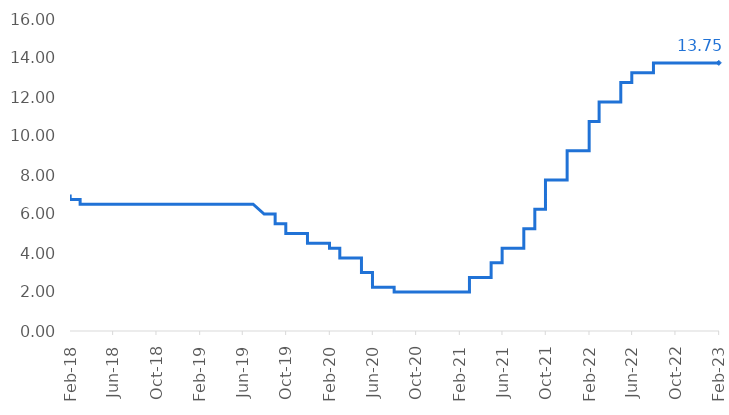
| Category | Selic |
|---|---|
| 2018-02-01 | 7 |
| 2018-02-01 | 7 |
| 2018-02-01 | 7 |
| 2018-02-01 | 7 |
| 2018-02-01 | 7 |
| 2018-02-01 | 7 |
| 2018-02-01 | 6.75 |
| 2018-02-01 | 6.75 |
| 2018-02-01 | 6.75 |
| 2018-02-01 | 6.75 |
| 2018-02-01 | 6.75 |
| 2018-02-01 | 6.75 |
| 2018-02-01 | 6.75 |
| 2018-02-01 | 6.75 |
| 2018-02-01 | 6.75 |
| 2018-02-01 | 6.75 |
| 2018-02-01 | 6.75 |
| 2018-02-01 | 6.75 |
| 2018-02-01 | 6.75 |
| 2018-02-01 | 6.75 |
| 2018-02-01 | 6.75 |
| 2018-02-01 | 6.75 |
| 2018-02-01 | 6.75 |
| 2018-02-01 | 6.75 |
| 2018-02-01 | 6.75 |
| 2018-02-01 | 6.75 |
| 2018-02-01 | 6.75 |
| 2018-03-01 | 6.75 |
| 2018-03-01 | 6.75 |
| 2018-03-01 | 6.75 |
| 2018-03-01 | 6.75 |
| 2018-03-01 | 6.75 |
| 2018-03-01 | 6.75 |
| 2018-03-01 | 6.75 |
| 2018-03-01 | 6.75 |
| 2018-03-01 | 6.75 |
| 2018-03-01 | 6.75 |
| 2018-03-01 | 6.75 |
| 2018-03-01 | 6.75 |
| 2018-03-01 | 6.75 |
| 2018-03-01 | 6.75 |
| 2018-03-01 | 6.75 |
| 2018-03-01 | 6.75 |
| 2018-03-01 | 6.75 |
| 2018-03-01 | 6.75 |
| 2018-03-01 | 6.75 |
| 2018-03-01 | 6.75 |
| 2018-03-01 | 6.75 |
| 2018-03-01 | 6.5 |
| 2018-03-01 | 6.5 |
| 2018-03-01 | 6.5 |
| 2018-03-01 | 6.5 |
| 2018-03-01 | 6.5 |
| 2018-03-01 | 6.5 |
| 2018-03-01 | 6.5 |
| 2018-03-01 | 6.5 |
| 2018-03-01 | 6.5 |
| 2018-03-01 | 6.5 |
| 2018-04-01 | 6.5 |
| 2018-04-01 | 6.5 |
| 2018-04-01 | 6.5 |
| 2018-04-01 | 6.5 |
| 2018-04-01 | 6.5 |
| 2018-04-01 | 6.5 |
| 2018-04-01 | 6.5 |
| 2018-04-01 | 6.5 |
| 2018-04-01 | 6.5 |
| 2018-04-01 | 6.5 |
| 2018-04-01 | 6.5 |
| 2018-04-01 | 6.5 |
| 2018-04-01 | 6.5 |
| 2018-04-01 | 6.5 |
| 2018-04-01 | 6.5 |
| 2018-04-01 | 6.5 |
| 2018-04-01 | 6.5 |
| 2018-04-01 | 6.5 |
| 2018-04-01 | 6.5 |
| 2018-04-01 | 6.5 |
| 2018-04-01 | 6.5 |
| 2018-04-01 | 6.5 |
| 2018-04-01 | 6.5 |
| 2018-04-01 | 6.5 |
| 2018-04-01 | 6.5 |
| 2018-04-01 | 6.5 |
| 2018-04-01 | 6.5 |
| 2018-04-01 | 6.5 |
| 2018-04-01 | 6.5 |
| 2018-04-01 | 6.5 |
| 2018-05-01 | 6.5 |
| 2018-05-01 | 6.5 |
| 2018-05-01 | 6.5 |
| 2018-05-01 | 6.5 |
| 2018-05-01 | 6.5 |
| 2018-05-01 | 6.5 |
| 2018-05-01 | 6.5 |
| 2018-05-01 | 6.5 |
| 2018-05-01 | 6.5 |
| 2018-05-01 | 6.5 |
| 2018-05-01 | 6.5 |
| 2018-05-01 | 6.5 |
| 2018-05-01 | 6.5 |
| 2018-05-01 | 6.5 |
| 2018-05-01 | 6.5 |
| 2018-05-01 | 6.5 |
| 2018-05-01 | 6.5 |
| 2018-05-01 | 6.5 |
| 2018-05-01 | 6.5 |
| 2018-05-01 | 6.5 |
| 2018-05-01 | 6.5 |
| 2018-05-01 | 6.5 |
| 2018-05-01 | 6.5 |
| 2018-05-01 | 6.5 |
| 2018-05-01 | 6.5 |
| 2018-05-01 | 6.5 |
| 2018-05-01 | 6.5 |
| 2018-05-01 | 6.5 |
| 2018-05-01 | 6.5 |
| 2018-05-01 | 6.5 |
| 2018-05-01 | 6.5 |
| 2018-06-01 | 6.5 |
| 2018-06-01 | 6.5 |
| 2018-06-01 | 6.5 |
| 2018-06-01 | 6.5 |
| 2018-06-01 | 6.5 |
| 2018-06-01 | 6.5 |
| 2018-06-01 | 6.5 |
| 2018-06-01 | 6.5 |
| 2018-06-01 | 6.5 |
| 2018-06-01 | 6.5 |
| 2018-06-01 | 6.5 |
| 2018-06-01 | 6.5 |
| 2018-06-01 | 6.5 |
| 2018-06-01 | 6.5 |
| 2018-06-01 | 6.5 |
| 2018-06-01 | 6.5 |
| 2018-06-01 | 6.5 |
| 2018-06-01 | 6.5 |
| 2018-06-01 | 6.5 |
| 2018-06-01 | 6.5 |
| 2018-06-01 | 6.5 |
| 2018-06-01 | 6.5 |
| 2018-06-01 | 6.5 |
| 2018-06-01 | 6.5 |
| 2018-06-01 | 6.5 |
| 2018-06-01 | 6.5 |
| 2018-06-01 | 6.5 |
| 2018-06-01 | 6.5 |
| 2018-06-01 | 6.5 |
| 2018-06-01 | 6.5 |
| 2018-07-01 | 6.5 |
| 2018-07-01 | 6.5 |
| 2018-07-01 | 6.5 |
| 2018-07-01 | 6.5 |
| 2018-07-01 | 6.5 |
| 2018-07-01 | 6.5 |
| 2018-07-01 | 6.5 |
| 2018-07-01 | 6.5 |
| 2018-07-01 | 6.5 |
| 2018-07-01 | 6.5 |
| 2018-07-01 | 6.5 |
| 2018-07-01 | 6.5 |
| 2018-07-01 | 6.5 |
| 2018-07-01 | 6.5 |
| 2018-07-01 | 6.5 |
| 2018-07-01 | 6.5 |
| 2018-07-01 | 6.5 |
| 2018-07-01 | 6.5 |
| 2018-07-01 | 6.5 |
| 2018-07-01 | 6.5 |
| 2018-07-01 | 6.5 |
| 2018-07-01 | 6.5 |
| 2018-07-01 | 6.5 |
| 2018-07-01 | 6.5 |
| 2018-07-01 | 6.5 |
| 2018-07-01 | 6.5 |
| 2018-07-01 | 6.5 |
| 2018-07-01 | 6.5 |
| 2018-07-01 | 6.5 |
| 2018-07-01 | 6.5 |
| 2018-07-01 | 6.5 |
| 2018-08-01 | 6.5 |
| 2018-08-01 | 6.5 |
| 2018-08-01 | 6.5 |
| 2018-08-01 | 6.5 |
| 2018-08-01 | 6.5 |
| 2018-08-01 | 6.5 |
| 2018-08-01 | 6.5 |
| 2018-08-01 | 6.5 |
| 2018-08-01 | 6.5 |
| 2018-08-01 | 6.5 |
| 2018-08-01 | 6.5 |
| 2018-08-01 | 6.5 |
| 2018-08-01 | 6.5 |
| 2018-08-01 | 6.5 |
| 2018-08-01 | 6.5 |
| 2018-08-01 | 6.5 |
| 2018-08-01 | 6.5 |
| 2018-08-01 | 6.5 |
| 2018-08-01 | 6.5 |
| 2018-08-01 | 6.5 |
| 2018-08-01 | 6.5 |
| 2018-08-01 | 6.5 |
| 2018-08-01 | 6.5 |
| 2018-08-01 | 6.5 |
| 2018-08-01 | 6.5 |
| 2018-08-01 | 6.5 |
| 2018-08-01 | 6.5 |
| 2018-08-01 | 6.5 |
| 2018-08-01 | 6.5 |
| 2018-08-01 | 6.5 |
| 2018-08-01 | 6.5 |
| 2018-09-01 | 6.5 |
| 2018-09-01 | 6.5 |
| 2018-09-01 | 6.5 |
| 2018-09-01 | 6.5 |
| 2018-09-01 | 6.5 |
| 2018-09-01 | 6.5 |
| 2018-09-01 | 6.5 |
| 2018-09-01 | 6.5 |
| 2018-09-01 | 6.5 |
| 2018-09-01 | 6.5 |
| 2018-09-01 | 6.5 |
| 2018-09-01 | 6.5 |
| 2018-09-01 | 6.5 |
| 2018-09-01 | 6.5 |
| 2018-09-01 | 6.5 |
| 2018-09-01 | 6.5 |
| 2018-09-01 | 6.5 |
| 2018-09-01 | 6.5 |
| 2018-09-01 | 6.5 |
| 2018-09-01 | 6.5 |
| 2018-09-01 | 6.5 |
| 2018-09-01 | 6.5 |
| 2018-09-01 | 6.5 |
| 2018-09-01 | 6.5 |
| 2018-09-01 | 6.5 |
| 2018-09-01 | 6.5 |
| 2018-09-01 | 6.5 |
| 2018-09-01 | 6.5 |
| 2018-09-01 | 6.5 |
| 2018-09-01 | 6.5 |
| 2018-10-01 | 6.5 |
| 2018-10-01 | 6.5 |
| 2018-10-01 | 6.5 |
| 2018-10-01 | 6.5 |
| 2018-10-01 | 6.5 |
| 2018-10-01 | 6.5 |
| 2018-10-01 | 6.5 |
| 2018-10-01 | 6.5 |
| 2018-10-01 | 6.5 |
| 2018-10-01 | 6.5 |
| 2018-10-01 | 6.5 |
| 2018-10-01 | 6.5 |
| 2018-10-01 | 6.5 |
| 2018-10-01 | 6.5 |
| 2018-10-01 | 6.5 |
| 2018-10-01 | 6.5 |
| 2018-10-01 | 6.5 |
| 2018-10-01 | 6.5 |
| 2018-10-01 | 6.5 |
| 2018-10-01 | 6.5 |
| 2018-10-01 | 6.5 |
| 2018-10-01 | 6.5 |
| 2018-10-01 | 6.5 |
| 2018-10-01 | 6.5 |
| 2018-10-01 | 6.5 |
| 2018-10-01 | 6.5 |
| 2018-10-01 | 6.5 |
| 2018-10-01 | 6.5 |
| 2018-10-01 | 6.5 |
| 2018-10-01 | 6.5 |
| 2018-10-01 | 6.5 |
| 2018-11-01 | 6.5 |
| 2018-11-01 | 6.5 |
| 2018-11-01 | 6.5 |
| 2018-11-01 | 6.5 |
| 2018-11-01 | 6.5 |
| 2018-11-01 | 6.5 |
| 2018-11-01 | 6.5 |
| 2018-11-01 | 6.5 |
| 2018-11-01 | 6.5 |
| 2018-11-01 | 6.5 |
| 2018-11-01 | 6.5 |
| 2018-11-01 | 6.5 |
| 2018-11-01 | 6.5 |
| 2018-11-01 | 6.5 |
| 2018-11-01 | 6.5 |
| 2018-11-01 | 6.5 |
| 2018-11-01 | 6.5 |
| 2018-11-01 | 6.5 |
| 2018-11-01 | 6.5 |
| 2018-11-01 | 6.5 |
| 2018-11-01 | 6.5 |
| 2018-11-01 | 6.5 |
| 2018-11-01 | 6.5 |
| 2018-11-01 | 6.5 |
| 2018-11-01 | 6.5 |
| 2018-11-01 | 6.5 |
| 2018-11-01 | 6.5 |
| 2018-11-01 | 6.5 |
| 2018-11-01 | 6.5 |
| 2018-11-01 | 6.5 |
| 2018-12-01 | 6.5 |
| 2018-12-01 | 6.5 |
| 2018-12-01 | 6.5 |
| 2018-12-01 | 6.5 |
| 2018-12-01 | 6.5 |
| 2018-12-01 | 6.5 |
| 2018-12-01 | 6.5 |
| 2018-12-01 | 6.5 |
| 2018-12-01 | 6.5 |
| 2018-12-01 | 6.5 |
| 2018-12-01 | 6.5 |
| 2018-12-01 | 6.5 |
| 2018-12-01 | 6.5 |
| 2018-12-01 | 6.5 |
| 2018-12-01 | 6.5 |
| 2018-12-01 | 6.5 |
| 2018-12-01 | 6.5 |
| 2018-12-01 | 6.5 |
| 2018-12-01 | 6.5 |
| 2018-12-01 | 6.5 |
| 2018-12-01 | 6.5 |
| 2018-12-01 | 6.5 |
| 2018-12-01 | 6.5 |
| 2018-12-01 | 6.5 |
| 2018-12-01 | 6.5 |
| 2018-12-01 | 6.5 |
| 2018-12-01 | 6.5 |
| 2018-12-01 | 6.5 |
| 2018-12-01 | 6.5 |
| 2018-12-01 | 6.5 |
| 2018-12-01 | 6.5 |
| 2019-01-01 | 6.5 |
| 2019-01-01 | 6.5 |
| 2019-01-01 | 6.5 |
| 2019-01-01 | 6.5 |
| 2019-01-01 | 6.5 |
| 2019-01-01 | 6.5 |
| 2019-01-01 | 6.5 |
| 2019-01-01 | 6.5 |
| 2019-01-01 | 6.5 |
| 2019-01-01 | 6.5 |
| 2019-01-01 | 6.5 |
| 2019-01-01 | 6.5 |
| 2019-01-01 | 6.5 |
| 2019-01-01 | 6.5 |
| 2019-01-01 | 6.5 |
| 2019-01-01 | 6.5 |
| 2019-01-01 | 6.5 |
| 2019-01-01 | 6.5 |
| 2019-01-01 | 6.5 |
| 2019-01-01 | 6.5 |
| 2019-01-01 | 6.5 |
| 2019-01-01 | 6.5 |
| 2019-01-01 | 6.5 |
| 2019-01-01 | 6.5 |
| 2019-01-01 | 6.5 |
| 2019-01-01 | 6.5 |
| 2019-01-01 | 6.5 |
| 2019-01-01 | 6.5 |
| 2019-01-01 | 6.5 |
| 2019-01-01 | 6.5 |
| 2019-01-01 | 6.5 |
| 2019-02-01 | 6.5 |
| 2019-02-01 | 6.5 |
| 2019-02-01 | 6.5 |
| 2019-02-01 | 6.5 |
| 2019-02-01 | 6.5 |
| 2019-02-01 | 6.5 |
| 2019-02-01 | 6.5 |
| 2019-02-01 | 6.5 |
| 2019-02-01 | 6.5 |
| 2019-02-01 | 6.5 |
| 2019-02-01 | 6.5 |
| 2019-02-01 | 6.5 |
| 2019-02-01 | 6.5 |
| 2019-02-01 | 6.5 |
| 2019-02-01 | 6.5 |
| 2019-02-01 | 6.5 |
| 2019-02-01 | 6.5 |
| 2019-02-01 | 6.5 |
| 2019-02-01 | 6.5 |
| 2019-02-01 | 6.5 |
| 2019-02-01 | 6.5 |
| 2019-02-01 | 6.5 |
| 2019-02-01 | 6.5 |
| 2019-02-01 | 6.5 |
| 2019-02-01 | 6.5 |
| 2019-02-01 | 6.5 |
| 2019-02-01 | 6.5 |
| 2019-02-01 | 6.5 |
| 2019-03-01 | 6.5 |
| 2019-03-01 | 6.5 |
| 2019-03-01 | 6.5 |
| 2019-03-01 | 6.5 |
| 2019-03-01 | 6.5 |
| 2019-03-01 | 6.5 |
| 2019-03-01 | 6.5 |
| 2019-03-01 | 6.5 |
| 2019-03-01 | 6.5 |
| 2019-03-01 | 6.5 |
| 2019-03-01 | 6.5 |
| 2019-03-01 | 6.5 |
| 2019-03-01 | 6.5 |
| 2019-03-01 | 6.5 |
| 2019-03-01 | 6.5 |
| 2019-03-01 | 6.5 |
| 2019-03-01 | 6.5 |
| 2019-03-01 | 6.5 |
| 2019-03-01 | 6.5 |
| 2019-03-01 | 6.5 |
| 2019-03-01 | 6.5 |
| 2019-03-01 | 6.5 |
| 2019-03-01 | 6.5 |
| 2019-03-01 | 6.5 |
| 2019-03-01 | 6.5 |
| 2019-03-01 | 6.5 |
| 2019-03-01 | 6.5 |
| 2019-03-01 | 6.5 |
| 2019-03-01 | 6.5 |
| 2019-03-01 | 6.5 |
| 2019-03-01 | 6.5 |
| 2019-04-01 | 6.5 |
| 2019-04-01 | 6.5 |
| 2019-04-01 | 6.5 |
| 2019-04-01 | 6.5 |
| 2019-04-01 | 6.5 |
| 2019-04-01 | 6.5 |
| 2019-04-01 | 6.5 |
| 2019-04-01 | 6.5 |
| 2019-04-01 | 6.5 |
| 2019-04-01 | 6.5 |
| 2019-04-01 | 6.5 |
| 2019-04-01 | 6.5 |
| 2019-04-01 | 6.5 |
| 2019-04-01 | 6.5 |
| 2019-04-01 | 6.5 |
| 2019-04-01 | 6.5 |
| 2019-04-01 | 6.5 |
| 2019-04-01 | 6.5 |
| 2019-04-01 | 6.5 |
| 2019-04-01 | 6.5 |
| 2019-04-01 | 6.5 |
| 2019-04-01 | 6.5 |
| 2019-04-01 | 6.5 |
| 2019-04-01 | 6.5 |
| 2019-04-01 | 6.5 |
| 2019-04-01 | 6.5 |
| 2019-04-01 | 6.5 |
| 2019-04-01 | 6.5 |
| 2019-04-01 | 6.5 |
| 2019-04-01 | 6.5 |
| 2019-05-01 | 6.5 |
| 2019-05-01 | 6.5 |
| 2019-05-01 | 6.5 |
| 2019-05-01 | 6.5 |
| 2019-05-01 | 6.5 |
| 2019-05-01 | 6.5 |
| 2019-05-01 | 6.5 |
| 2019-05-01 | 6.5 |
| 2019-05-01 | 6.5 |
| 2019-05-01 | 6.5 |
| 2019-05-01 | 6.5 |
| 2019-05-01 | 6.5 |
| 2019-05-01 | 6.5 |
| 2019-05-01 | 6.5 |
| 2019-05-01 | 6.5 |
| 2019-05-01 | 6.5 |
| 2019-05-01 | 6.5 |
| 2019-05-01 | 6.5 |
| 2019-05-01 | 6.5 |
| 2019-05-01 | 6.5 |
| 2019-05-01 | 6.5 |
| 2019-05-01 | 6.5 |
| 2019-05-01 | 6.5 |
| 2019-05-01 | 6.5 |
| 2019-05-01 | 6.5 |
| 2019-05-01 | 6.5 |
| 2019-05-01 | 6.5 |
| 2019-05-01 | 6.5 |
| 2019-05-01 | 6.5 |
| 2019-05-01 | 6.5 |
| 2019-05-01 | 6.5 |
| 2019-06-01 | 6.5 |
| 2019-06-01 | 6.5 |
| 2019-06-01 | 6.5 |
| 2019-06-01 | 6.5 |
| 2019-06-01 | 6.5 |
| 2019-06-01 | 6.5 |
| 2019-06-01 | 6.5 |
| 2019-06-01 | 6.5 |
| 2019-06-01 | 6.5 |
| 2019-06-01 | 6.5 |
| 2019-06-01 | 6.5 |
| 2019-06-01 | 6.5 |
| 2019-06-01 | 6.5 |
| 2019-06-01 | 6.5 |
| 2019-06-01 | 6.5 |
| 2019-06-01 | 6.5 |
| 2019-06-01 | 6.5 |
| 2019-06-01 | 6.5 |
| 2019-06-01 | 6.5 |
| 2019-06-01 | 6.5 |
| 2019-06-01 | 6.5 |
| 2019-06-01 | 6.5 |
| 2019-06-01 | 6.5 |
| 2019-06-01 | 6.5 |
| 2019-06-01 | 6.5 |
| 2019-06-01 | 6.5 |
| 2019-06-01 | 6.5 |
| 2019-06-01 | 6.5 |
| 2019-06-01 | 6.5 |
| 2019-06-01 | 6.5 |
| 2019-07-01 | 6.5 |
| 2019-07-01 | 6.5 |
| 2019-07-01 | 6.5 |
| 2019-07-01 | 6.5 |
| 2019-07-01 | 6.5 |
| 2019-07-01 | 6.5 |
| 2019-07-01 | 6.5 |
| 2019-07-01 | 6.5 |
| 2019-07-01 | 6.5 |
| 2019-07-01 | 6.5 |
| 2019-07-01 | 6.5 |
| 2019-07-01 | 6.5 |
| 2019-07-01 | 6.5 |
| 2019-07-01 | 6.5 |
| 2019-07-01 | 6.5 |
| 2019-07-01 | 6.5 |
| 2019-07-01 | 6.5 |
| 2019-07-01 | 6.5 |
| 2019-07-01 | 6.5 |
| 2019-07-01 | 6.5 |
| 2019-07-01 | 6.5 |
| 2019-07-01 | 6.5 |
| 2019-07-01 | 6.5 |
| 2019-07-01 | 6.5 |
| 2019-07-01 | 6.5 |
| 2019-07-01 | 6.5 |
| 2019-07-01 | 6.5 |
| 2019-07-01 | 6.5 |
| 2019-07-01 | 6.5 |
| 2019-07-01 | 6.5 |
| 2019-07-01 | 6.5 |
| 2019-08-01 | 6 |
| 2019-08-01 | 6 |
| 2019-08-01 | 6 |
| 2019-08-01 | 6 |
| 2019-08-01 | 6 |
| 2019-08-01 | 6 |
| 2019-08-01 | 6 |
| 2019-08-01 | 6 |
| 2019-08-01 | 6 |
| 2019-08-01 | 6 |
| 2019-08-01 | 6 |
| 2019-08-01 | 6 |
| 2019-08-01 | 6 |
| 2019-08-01 | 6 |
| 2019-08-01 | 6 |
| 2019-08-01 | 6 |
| 2019-08-01 | 6 |
| 2019-08-01 | 6 |
| 2019-08-01 | 6 |
| 2019-08-01 | 6 |
| 2019-08-01 | 6 |
| 2019-08-01 | 6 |
| 2019-08-01 | 6 |
| 2019-08-01 | 6 |
| 2019-08-01 | 6 |
| 2019-08-01 | 6 |
| 2019-08-01 | 6 |
| 2019-08-01 | 6 |
| 2019-08-01 | 6 |
| 2019-08-01 | 6 |
| 2019-08-01 | 6 |
| 2019-09-01 | 6 |
| 2019-09-01 | 6 |
| 2019-09-01 | 6 |
| 2019-09-01 | 6 |
| 2019-09-01 | 6 |
| 2019-09-01 | 6 |
| 2019-09-01 | 6 |
| 2019-09-01 | 6 |
| 2019-09-01 | 6 |
| 2019-09-01 | 6 |
| 2019-09-01 | 6 |
| 2019-09-01 | 6 |
| 2019-09-01 | 6 |
| 2019-09-01 | 6 |
| 2019-09-01 | 6 |
| 2019-09-01 | 6 |
| 2019-09-01 | 6 |
| 2019-09-01 | 6 |
| 2019-09-01 | 5.5 |
| 2019-09-01 | 5.5 |
| 2019-09-01 | 5.5 |
| 2019-09-01 | 5.5 |
| 2019-09-01 | 5.5 |
| 2019-09-01 | 5.5 |
| 2019-09-01 | 5.5 |
| 2019-09-01 | 5.5 |
| 2019-09-01 | 5.5 |
| 2019-09-01 | 5.5 |
| 2019-09-01 | 5.5 |
| 2019-09-01 | 5.5 |
| 2019-10-01 | 5.5 |
| 2019-10-01 | 5.5 |
| 2019-10-01 | 5.5 |
| 2019-10-01 | 5.5 |
| 2019-10-01 | 5.5 |
| 2019-10-01 | 5.5 |
| 2019-10-01 | 5.5 |
| 2019-10-01 | 5.5 |
| 2019-10-01 | 5.5 |
| 2019-10-01 | 5.5 |
| 2019-10-01 | 5.5 |
| 2019-10-01 | 5.5 |
| 2019-10-01 | 5.5 |
| 2019-10-01 | 5.5 |
| 2019-10-01 | 5.5 |
| 2019-10-01 | 5.5 |
| 2019-10-01 | 5.5 |
| 2019-10-01 | 5.5 |
| 2019-10-01 | 5.5 |
| 2019-10-01 | 5.5 |
| 2019-10-01 | 5.5 |
| 2019-10-01 | 5.5 |
| 2019-10-01 | 5.5 |
| 2019-10-01 | 5.5 |
| 2019-10-01 | 5.5 |
| 2019-10-01 | 5.5 |
| 2019-10-01 | 5.5 |
| 2019-10-01 | 5.5 |
| 2019-10-01 | 5.5 |
| 2019-10-01 | 5.5 |
| 2019-10-01 | 5 |
| 2019-11-01 | 5 |
| 2019-11-01 | 5 |
| 2019-11-01 | 5 |
| 2019-11-01 | 5 |
| 2019-11-01 | 5 |
| 2019-11-01 | 5 |
| 2019-11-01 | 5 |
| 2019-11-01 | 5 |
| 2019-11-01 | 5 |
| 2019-11-01 | 5 |
| 2019-11-01 | 5 |
| 2019-11-01 | 5 |
| 2019-11-01 | 5 |
| 2019-11-01 | 5 |
| 2019-11-01 | 5 |
| 2019-11-01 | 5 |
| 2019-11-01 | 5 |
| 2019-11-01 | 5 |
| 2019-11-01 | 5 |
| 2019-11-01 | 5 |
| 2019-11-01 | 5 |
| 2019-11-01 | 5 |
| 2019-11-01 | 5 |
| 2019-11-01 | 5 |
| 2019-11-01 | 5 |
| 2019-11-01 | 5 |
| 2019-11-01 | 5 |
| 2019-11-01 | 5 |
| 2019-11-01 | 5 |
| 2019-11-01 | 5 |
| 2019-12-01 | 5 |
| 2019-12-01 | 5 |
| 2019-12-01 | 5 |
| 2019-12-01 | 5 |
| 2019-12-01 | 5 |
| 2019-12-01 | 5 |
| 2019-12-01 | 5 |
| 2019-12-01 | 5 |
| 2019-12-01 | 5 |
| 2019-12-01 | 5 |
| 2019-12-01 | 5 |
| 2019-12-01 | 4.5 |
| 2019-12-01 | 4.5 |
| 2019-12-01 | 4.5 |
| 2019-12-01 | 4.5 |
| 2019-12-01 | 4.5 |
| 2019-12-01 | 4.5 |
| 2019-12-01 | 4.5 |
| 2019-12-01 | 4.5 |
| 2019-12-01 | 4.5 |
| 2019-12-01 | 4.5 |
| 2019-12-01 | 4.5 |
| 2019-12-01 | 4.5 |
| 2019-12-01 | 4.5 |
| 2019-12-01 | 4.5 |
| 2019-12-01 | 4.5 |
| 2019-12-01 | 4.5 |
| 2019-12-01 | 4.5 |
| 2019-12-01 | 4.5 |
| 2019-12-01 | 4.5 |
| 2019-12-01 | 4.5 |
| 2020-01-01 | 4.5 |
| 2020-01-01 | 4.5 |
| 2020-01-01 | 4.5 |
| 2020-01-01 | 4.5 |
| 2020-01-01 | 4.5 |
| 2020-01-01 | 4.5 |
| 2020-01-01 | 4.5 |
| 2020-01-01 | 4.5 |
| 2020-01-01 | 4.5 |
| 2020-01-01 | 4.5 |
| 2020-01-01 | 4.5 |
| 2020-01-01 | 4.5 |
| 2020-01-01 | 4.5 |
| 2020-01-01 | 4.5 |
| 2020-01-01 | 4.5 |
| 2020-01-01 | 4.5 |
| 2020-01-01 | 4.5 |
| 2020-01-01 | 4.5 |
| 2020-01-01 | 4.5 |
| 2020-01-01 | 4.5 |
| 2020-01-01 | 4.5 |
| 2020-01-01 | 4.5 |
| 2020-01-01 | 4.5 |
| 2020-01-01 | 4.5 |
| 2020-01-01 | 4.5 |
| 2020-01-01 | 4.5 |
| 2020-01-01 | 4.5 |
| 2020-01-01 | 4.5 |
| 2020-01-01 | 4.5 |
| 2020-01-01 | 4.5 |
| 2020-01-01 | 4.5 |
| 2020-02-01 | 4.5 |
| 2020-02-01 | 4.5 |
| 2020-02-01 | 4.5 |
| 2020-02-01 | 4.5 |
| 2020-02-01 | 4.5 |
| 2020-02-01 | 4.25 |
| 2020-02-01 | 4.25 |
| 2020-02-01 | 4.25 |
| 2020-02-01 | 4.25 |
| 2020-02-01 | 4.25 |
| 2020-02-01 | 4.25 |
| 2020-02-01 | 4.25 |
| 2020-02-01 | 4.25 |
| 2020-02-01 | 4.25 |
| 2020-02-01 | 4.25 |
| 2020-02-01 | 4.25 |
| 2020-02-01 | 4.25 |
| 2020-02-01 | 4.25 |
| 2020-02-01 | 4.25 |
| 2020-02-01 | 4.25 |
| 2020-02-01 | 4.25 |
| 2020-02-01 | 4.25 |
| 2020-02-01 | 4.25 |
| 2020-02-01 | 4.25 |
| 2020-02-01 | 4.25 |
| 2020-02-01 | 4.25 |
| 2020-02-01 | 4.25 |
| 2020-02-01 | 4.25 |
| 2020-02-01 | 4.25 |
| 2020-03-01 | 4.25 |
| 2020-03-01 | 4.25 |
| 2020-03-01 | 4.25 |
| 2020-03-01 | 4.25 |
| 2020-03-01 | 4.25 |
| 2020-03-01 | 4.25 |
| 2020-03-01 | 4.25 |
| 2020-03-01 | 4.25 |
| 2020-03-01 | 4.25 |
| 2020-03-01 | 4.25 |
| 2020-03-01 | 4.25 |
| 2020-03-01 | 4.25 |
| 2020-03-01 | 4.25 |
| 2020-03-01 | 4.25 |
| 2020-03-01 | 4.25 |
| 2020-03-01 | 4.25 |
| 2020-03-01 | 4.25 |
| 2020-03-01 | 4.25 |
| 2020-03-01 | 3.75 |
| 2020-03-01 | 3.75 |
| 2020-03-01 | 3.75 |
| 2020-03-01 | 3.75 |
| 2020-03-01 | 3.75 |
| 2020-03-01 | 3.75 |
| 2020-03-01 | 3.75 |
| 2020-03-01 | 3.75 |
| 2020-03-01 | 3.75 |
| 2020-03-01 | 3.75 |
| 2020-03-01 | 3.75 |
| 2020-03-01 | 3.75 |
| 2020-03-01 | 3.75 |
| 2020-04-01 | 3.75 |
| 2020-04-01 | 3.75 |
| 2020-04-01 | 3.75 |
| 2020-04-01 | 3.75 |
| 2020-04-01 | 3.75 |
| 2020-04-01 | 3.75 |
| 2020-04-01 | 3.75 |
| 2020-04-01 | 3.75 |
| 2020-04-01 | 3.75 |
| 2020-04-01 | 3.75 |
| 2020-04-01 | 3.75 |
| 2020-04-01 | 3.75 |
| 2020-04-01 | 3.75 |
| 2020-04-01 | 3.75 |
| 2020-04-01 | 3.75 |
| 2020-04-01 | 3.75 |
| 2020-04-01 | 3.75 |
| 2020-04-01 | 3.75 |
| 2020-04-01 | 3.75 |
| 2020-04-01 | 3.75 |
| 2020-04-01 | 3.75 |
| 2020-04-01 | 3.75 |
| 2020-04-01 | 3.75 |
| 2020-04-01 | 3.75 |
| 2020-04-01 | 3.75 |
| 2020-04-01 | 3.75 |
| 2020-04-01 | 3.75 |
| 2020-04-01 | 3.75 |
| 2020-04-01 | 3.75 |
| 2020-04-01 | 3.75 |
| 2020-05-01 | 3.75 |
| 2020-05-01 | 3.75 |
| 2020-05-01 | 3.75 |
| 2020-05-01 | 3.75 |
| 2020-05-01 | 3.75 |
| 2020-05-01 | 3.75 |
| 2020-05-01 | 3 |
| 2020-05-01 | 3 |
| 2020-05-01 | 3 |
| 2020-05-01 | 3 |
| 2020-05-01 | 3 |
| 2020-05-01 | 3 |
| 2020-05-01 | 3 |
| 2020-05-01 | 3 |
| 2020-05-01 | 3 |
| 2020-05-01 | 3 |
| 2020-05-01 | 3 |
| 2020-05-01 | 3 |
| 2020-05-01 | 3 |
| 2020-05-01 | 3 |
| 2020-05-01 | 3 |
| 2020-05-01 | 3 |
| 2020-05-01 | 3 |
| 2020-05-01 | 3 |
| 2020-05-01 | 3 |
| 2020-05-01 | 3 |
| 2020-05-01 | 3 |
| 2020-05-01 | 3 |
| 2020-05-01 | 3 |
| 2020-05-01 | 3 |
| 2020-05-01 | 3 |
| 2020-06-01 | 3 |
| 2020-06-01 | 3 |
| 2020-06-01 | 3 |
| 2020-06-01 | 3 |
| 2020-06-01 | 3 |
| 2020-06-01 | 3 |
| 2020-06-01 | 3 |
| 2020-06-01 | 3 |
| 2020-06-01 | 3 |
| 2020-06-01 | 3 |
| 2020-06-01 | 3 |
| 2020-06-01 | 3 |
| 2020-06-01 | 3 |
| 2020-06-01 | 3 |
| 2020-06-01 | 3 |
| 2020-06-01 | 3 |
| 2020-06-01 | 3 |
| 2020-06-01 | 2.25 |
| 2020-06-01 | 2.25 |
| 2020-06-01 | 2.25 |
| 2020-06-01 | 2.25 |
| 2020-06-01 | 2.25 |
| 2020-06-01 | 2.25 |
| 2020-06-01 | 2.25 |
| 2020-06-01 | 2.25 |
| 2020-06-01 | 2.25 |
| 2020-06-01 | 2.25 |
| 2020-06-01 | 2.25 |
| 2020-06-01 | 2.25 |
| 2020-06-01 | 2.25 |
| 2020-07-01 | 2.25 |
| 2020-07-01 | 2.25 |
| 2020-07-01 | 2.25 |
| 2020-07-01 | 2.25 |
| 2020-07-01 | 2.25 |
| 2020-07-01 | 2.25 |
| 2020-07-01 | 2.25 |
| 2020-07-01 | 2.25 |
| 2020-07-01 | 2.25 |
| 2020-07-01 | 2.25 |
| 2020-07-01 | 2.25 |
| 2020-07-01 | 2.25 |
| 2020-07-01 | 2.25 |
| 2020-07-01 | 2.25 |
| 2020-07-01 | 2.25 |
| 2020-07-01 | 2.25 |
| 2020-07-01 | 2.25 |
| 2020-07-01 | 2.25 |
| 2020-07-01 | 2.25 |
| 2020-07-01 | 2.25 |
| 2020-07-01 | 2.25 |
| 2020-07-01 | 2.25 |
| 2020-07-01 | 2.25 |
| 2020-07-01 | 2.25 |
| 2020-07-01 | 2.25 |
| 2020-07-01 | 2.25 |
| 2020-07-01 | 2.25 |
| 2020-07-01 | 2.25 |
| 2020-07-01 | 2.25 |
| 2020-07-01 | 2.25 |
| 2020-07-01 | 2.25 |
| 2020-08-01 | 2.25 |
| 2020-08-01 | 2.25 |
| 2020-08-01 | 2.25 |
| 2020-08-01 | 2.25 |
| 2020-08-01 | 2.25 |
| 2020-08-01 | 2 |
| 2020-08-01 | 2 |
| 2020-08-01 | 2 |
| 2020-08-01 | 2 |
| 2020-08-01 | 2 |
| 2020-08-01 | 2 |
| 2020-08-01 | 2 |
| 2020-08-01 | 2 |
| 2020-08-01 | 2 |
| 2020-08-01 | 2 |
| 2020-08-01 | 2 |
| 2020-08-01 | 2 |
| 2020-08-01 | 2 |
| 2020-08-01 | 2 |
| 2020-08-01 | 2 |
| 2020-08-01 | 2 |
| 2020-08-01 | 2 |
| 2020-08-01 | 2 |
| 2020-08-01 | 2 |
| 2020-08-01 | 2 |
| 2020-08-01 | 2 |
| 2020-08-01 | 2 |
| 2020-08-01 | 2 |
| 2020-08-01 | 2 |
| 2020-08-01 | 2 |
| 2020-08-01 | 2 |
| 2020-09-01 | 2 |
| 2020-09-01 | 2 |
| 2020-09-01 | 2 |
| 2020-09-01 | 2 |
| 2020-09-01 | 2 |
| 2020-09-01 | 2 |
| 2020-09-01 | 2 |
| 2020-09-01 | 2 |
| 2020-09-01 | 2 |
| 2020-09-01 | 2 |
| 2020-09-01 | 2 |
| 2020-09-01 | 2 |
| 2020-09-01 | 2 |
| 2020-09-01 | 2 |
| 2020-09-01 | 2 |
| 2020-09-01 | 2 |
| 2020-09-01 | 2 |
| 2020-09-01 | 2 |
| 2020-09-01 | 2 |
| 2020-09-01 | 2 |
| 2020-09-01 | 2 |
| 2020-09-01 | 2 |
| 2020-09-01 | 2 |
| 2020-09-01 | 2 |
| 2020-09-01 | 2 |
| 2020-09-01 | 2 |
| 2020-09-01 | 2 |
| 2020-09-01 | 2 |
| 2020-09-01 | 2 |
| 2020-09-01 | 2 |
| 2020-10-01 | 2 |
| 2020-10-01 | 2 |
| 2020-10-01 | 2 |
| 2020-10-01 | 2 |
| 2020-10-01 | 2 |
| 2020-10-01 | 2 |
| 2020-10-01 | 2 |
| 2020-10-01 | 2 |
| 2020-10-01 | 2 |
| 2020-10-01 | 2 |
| 2020-10-01 | 2 |
| 2020-10-01 | 2 |
| 2020-10-01 | 2 |
| 2020-10-01 | 2 |
| 2020-10-01 | 2 |
| 2020-10-01 | 2 |
| 2020-10-01 | 2 |
| 2020-10-01 | 2 |
| 2020-10-01 | 2 |
| 2020-10-01 | 2 |
| 2020-10-01 | 2 |
| 2020-10-01 | 2 |
| 2020-10-01 | 2 |
| 2020-10-01 | 2 |
| 2020-10-01 | 2 |
| 2020-10-01 | 2 |
| 2020-10-01 | 2 |
| 2020-10-01 | 2 |
| 2020-10-01 | 2 |
| 2020-10-01 | 2 |
| 2020-10-01 | 2 |
| 2020-11-01 | 2 |
| 2020-11-01 | 2 |
| 2020-11-01 | 2 |
| 2020-11-01 | 2 |
| 2020-11-01 | 2 |
| 2020-11-01 | 2 |
| 2020-11-01 | 2 |
| 2020-11-01 | 2 |
| 2020-11-01 | 2 |
| 2020-11-01 | 2 |
| 2020-11-01 | 2 |
| 2020-11-01 | 2 |
| 2020-11-01 | 2 |
| 2020-11-01 | 2 |
| 2020-11-01 | 2 |
| 2020-11-01 | 2 |
| 2020-11-01 | 2 |
| 2020-11-01 | 2 |
| 2020-11-01 | 2 |
| 2020-11-01 | 2 |
| 2020-11-01 | 2 |
| 2020-11-01 | 2 |
| 2020-11-01 | 2 |
| 2020-11-01 | 2 |
| 2020-11-01 | 2 |
| 2020-11-01 | 2 |
| 2020-11-01 | 2 |
| 2020-11-01 | 2 |
| 2020-11-01 | 2 |
| 2020-11-01 | 2 |
| 2020-12-01 | 2 |
| 2020-12-01 | 2 |
| 2020-12-01 | 2 |
| 2020-12-01 | 2 |
| 2020-12-01 | 2 |
| 2020-12-01 | 2 |
| 2020-12-01 | 2 |
| 2020-12-01 | 2 |
| 2020-12-01 | 2 |
| 2020-12-01 | 2 |
| 2020-12-01 | 2 |
| 2020-12-01 | 2 |
| 2020-12-01 | 2 |
| 2020-12-01 | 2 |
| 2020-12-01 | 2 |
| 2020-12-01 | 2 |
| 2020-12-01 | 2 |
| 2020-12-01 | 2 |
| 2020-12-01 | 2 |
| 2020-12-01 | 2 |
| 2020-12-01 | 2 |
| 2020-12-01 | 2 |
| 2020-12-01 | 2 |
| 2020-12-01 | 2 |
| 2020-12-01 | 2 |
| 2020-12-01 | 2 |
| 2020-12-01 | 2 |
| 2020-12-01 | 2 |
| 2020-12-01 | 2 |
| 2020-12-01 | 2 |
| 2020-12-01 | 2 |
| 2021-01-01 | 2 |
| 2021-01-01 | 2 |
| 2021-01-01 | 2 |
| 2021-01-01 | 2 |
| 2021-01-01 | 2 |
| 2021-01-01 | 2 |
| 2021-01-01 | 2 |
| 2021-01-01 | 2 |
| 2021-01-01 | 2 |
| 2021-01-01 | 2 |
| 2021-01-01 | 2 |
| 2021-01-01 | 2 |
| 2021-01-01 | 2 |
| 2021-01-01 | 2 |
| 2021-01-01 | 2 |
| 2021-01-01 | 2 |
| 2021-01-01 | 2 |
| 2021-01-01 | 2 |
| 2021-01-01 | 2 |
| 2021-01-01 | 2 |
| 2021-01-01 | 2 |
| 2021-01-01 | 2 |
| 2021-01-01 | 2 |
| 2021-01-01 | 2 |
| 2021-01-01 | 2 |
| 2021-01-01 | 2 |
| 2021-01-01 | 2 |
| 2021-01-01 | 2 |
| 2021-01-01 | 2 |
| 2021-01-01 | 2 |
| 2021-01-01 | 2 |
| 2021-02-01 | 2 |
| 2021-02-01 | 2 |
| 2021-02-01 | 2 |
| 2021-02-01 | 2 |
| 2021-02-01 | 2 |
| 2021-02-01 | 2 |
| 2021-02-01 | 2 |
| 2021-02-01 | 2 |
| 2021-02-01 | 2 |
| 2021-02-01 | 2 |
| 2021-02-01 | 2 |
| 2021-02-01 | 2 |
| 2021-02-01 | 2 |
| 2021-02-01 | 2 |
| 2021-02-01 | 2 |
| 2021-02-01 | 2 |
| 2021-02-01 | 2 |
| 2021-02-01 | 2 |
| 2021-02-01 | 2 |
| 2021-02-01 | 2 |
| 2021-02-01 | 2 |
| 2021-02-01 | 2 |
| 2021-02-01 | 2 |
| 2021-02-01 | 2 |
| 2021-02-01 | 2 |
| 2021-02-01 | 2 |
| 2021-02-01 | 2 |
| 2021-02-01 | 2 |
| 2021-03-01 | 2 |
| 2021-03-01 | 2 |
| 2021-03-01 | 2 |
| 2021-03-01 | 2 |
| 2021-03-01 | 2 |
| 2021-03-01 | 2 |
| 2021-03-01 | 2 |
| 2021-03-01 | 2 |
| 2021-03-01 | 2 |
| 2021-03-01 | 2 |
| 2021-03-01 | 2 |
| 2021-03-01 | 2 |
| 2021-03-01 | 2 |
| 2021-03-01 | 2 |
| 2021-03-01 | 2 |
| 2021-03-01 | 2 |
| 2021-03-01 | 2 |
| 2021-03-01 | 2.75 |
| 2021-03-01 | 2.75 |
| 2021-03-01 | 2.75 |
| 2021-03-01 | 2.75 |
| 2021-03-01 | 2.75 |
| 2021-03-01 | 2.75 |
| 2021-03-01 | 2.75 |
| 2021-03-01 | 2.75 |
| 2021-03-01 | 2.75 |
| 2021-03-01 | 2.75 |
| 2021-03-01 | 2.75 |
| 2021-03-01 | 2.75 |
| 2021-03-01 | 2.75 |
| 2021-03-01 | 2.75 |
| 2021-04-01 | 2.75 |
| 2021-04-01 | 2.75 |
| 2021-04-01 | 2.75 |
| 2021-04-01 | 2.75 |
| 2021-04-01 | 2.75 |
| 2021-04-01 | 2.75 |
| 2021-04-01 | 2.75 |
| 2021-04-01 | 2.75 |
| 2021-04-01 | 2.75 |
| 2021-04-01 | 2.75 |
| 2021-04-01 | 2.75 |
| 2021-04-01 | 2.75 |
| 2021-04-01 | 2.75 |
| 2021-04-01 | 2.75 |
| 2021-04-01 | 2.75 |
| 2021-04-01 | 2.75 |
| 2021-04-01 | 2.75 |
| 2021-04-01 | 2.75 |
| 2021-04-01 | 2.75 |
| 2021-04-01 | 2.75 |
| 2021-04-01 | 2.75 |
| 2021-04-01 | 2.75 |
| 2021-04-01 | 2.75 |
| 2021-04-01 | 2.75 |
| 2021-04-01 | 2.75 |
| 2021-04-01 | 2.75 |
| 2021-04-01 | 2.75 |
| 2021-04-01 | 2.75 |
| 2021-04-01 | 2.75 |
| 2021-04-01 | 2.75 |
| 2021-05-01 | 2.75 |
| 2021-05-01 | 2.75 |
| 2021-05-01 | 2.75 |
| 2021-05-01 | 2.75 |
| 2021-05-01 | 2.75 |
| 2021-05-01 | 3.5 |
| 2021-05-01 | 3.5 |
| 2021-05-01 | 3.5 |
| 2021-05-01 | 3.5 |
| 2021-05-01 | 3.5 |
| 2021-05-01 | 3.5 |
| 2021-05-01 | 3.5 |
| 2021-05-01 | 3.5 |
| 2021-05-01 | 3.5 |
| 2021-05-01 | 3.5 |
| 2021-05-01 | 3.5 |
| 2021-05-01 | 3.5 |
| 2021-05-01 | 3.5 |
| 2021-05-01 | 3.5 |
| 2021-05-01 | 3.5 |
| 2021-05-01 | 3.5 |
| 2021-05-01 | 3.5 |
| 2021-05-01 | 3.5 |
| 2021-05-01 | 3.5 |
| 2021-05-01 | 3.5 |
| 2021-05-01 | 3.5 |
| 2021-05-01 | 3.5 |
| 2021-05-01 | 3.5 |
| 2021-05-01 | 3.5 |
| 2021-05-01 | 3.5 |
| 2021-05-01 | 3.5 |
| 2021-06-01 | 3.5 |
| 2021-06-01 | 3.5 |
| 2021-06-01 | 3.5 |
| 2021-06-01 | 3.5 |
| 2021-06-01 | 3.5 |
| 2021-06-01 | 3.5 |
| 2021-06-01 | 3.5 |
| 2021-06-01 | 3.5 |
| 2021-06-01 | 3.5 |
| 2021-06-01 | 3.5 |
| 2021-06-01 | 3.5 |
| 2021-06-01 | 3.5 |
| 2021-06-01 | 3.5 |
| 2021-06-01 | 3.5 |
| 2021-06-01 | 3.5 |
| 2021-06-01 | 3.5 |
| 2021-06-01 | 4.25 |
| 2021-06-01 | 4.25 |
| 2021-06-01 | 4.25 |
| 2021-06-01 | 4.25 |
| 2021-06-01 | 4.25 |
| 2021-06-01 | 4.25 |
| 2021-06-01 | 4.25 |
| 2021-06-01 | 4.25 |
| 2021-06-01 | 4.25 |
| 2021-06-01 | 4.25 |
| 2021-06-01 | 4.25 |
| 2021-06-01 | 4.25 |
| 2021-06-01 | 4.25 |
| 2021-06-01 | 4.25 |
| 2021-07-01 | 4.25 |
| 2021-07-01 | 4.25 |
| 2021-07-01 | 4.25 |
| 2021-07-01 | 4.25 |
| 2021-07-01 | 4.25 |
| 2021-07-01 | 4.25 |
| 2021-07-01 | 4.25 |
| 2021-07-01 | 4.25 |
| 2021-07-01 | 4.25 |
| 2021-07-01 | 4.25 |
| 2021-07-01 | 4.25 |
| 2021-07-01 | 4.25 |
| 2021-07-01 | 4.25 |
| 2021-07-01 | 4.25 |
| 2021-07-01 | 4.25 |
| 2021-07-01 | 4.25 |
| 2021-07-01 | 4.25 |
| 2021-07-01 | 4.25 |
| 2021-07-01 | 4.25 |
| 2021-07-01 | 4.25 |
| 2021-07-01 | 4.25 |
| 2021-07-01 | 4.25 |
| 2021-07-01 | 4.25 |
| 2021-07-01 | 4.25 |
| 2021-07-01 | 4.25 |
| 2021-07-01 | 4.25 |
| 2021-07-01 | 4.25 |
| 2021-07-01 | 4.25 |
| 2021-07-01 | 4.25 |
| 2021-07-01 | 4.25 |
| 2021-07-01 | 4.25 |
| 2021-08-01 | 4.25 |
| 2021-08-01 | 4.25 |
| 2021-08-01 | 4.25 |
| 2021-08-01 | 4.25 |
| 2021-08-01 | 5.25 |
| 2021-08-01 | 5.25 |
| 2021-08-01 | 5.25 |
| 2021-08-01 | 5.25 |
| 2021-08-01 | 5.25 |
| 2021-08-01 | 5.25 |
| 2021-08-01 | 5.25 |
| 2021-08-01 | 5.25 |
| 2021-08-01 | 5.25 |
| 2021-08-01 | 5.25 |
| 2021-08-01 | 5.25 |
| 2021-08-01 | 5.25 |
| 2021-08-01 | 5.25 |
| 2021-08-01 | 5.25 |
| 2021-08-01 | 5.25 |
| 2021-08-01 | 5.25 |
| 2021-08-01 | 5.25 |
| 2021-08-01 | 5.25 |
| 2021-08-01 | 5.25 |
| 2021-08-01 | 5.25 |
| 2021-08-01 | 5.25 |
| 2021-08-01 | 5.25 |
| 2021-08-01 | 5.25 |
| 2021-08-01 | 5.25 |
| 2021-08-01 | 5.25 |
| 2021-08-01 | 5.25 |
| 2021-08-01 | 5.25 |
| 2021-09-01 | 5.25 |
| 2021-09-01 | 5.25 |
| 2021-09-01 | 5.25 |
| 2021-09-01 | 5.25 |
| 2021-09-01 | 5.25 |
| 2021-09-01 | 5.25 |
| 2021-09-01 | 5.25 |
| 2021-09-01 | 5.25 |
| 2021-09-01 | 5.25 |
| 2021-09-01 | 5.25 |
| 2021-09-01 | 5.25 |
| 2021-09-01 | 5.25 |
| 2021-09-01 | 5.25 |
| 2021-09-01 | 5.25 |
| 2021-09-01 | 5.25 |
| 2021-09-01 | 5.25 |
| 2021-09-01 | 5.25 |
| 2021-09-01 | 5.25 |
| 2021-09-01 | 5.25 |
| 2021-09-01 | 5.25 |
| 2021-09-01 | 5.25 |
| 2021-09-01 | 5.25 |
| 2021-09-01 | 6.25 |
| 2021-09-01 | 6.25 |
| 2021-09-01 | 6.25 |
| 2021-09-01 | 6.25 |
| 2021-09-01 | 6.25 |
| 2021-09-01 | 6.25 |
| 2021-09-01 | 6.25 |
| 2021-09-01 | 6.25 |
| 2021-10-01 | 6.25 |
| 2021-10-01 | 6.25 |
| 2021-10-01 | 6.25 |
| 2021-10-01 | 6.25 |
| 2021-10-01 | 6.25 |
| 2021-10-01 | 6.25 |
| 2021-10-01 | 6.25 |
| 2021-10-01 | 6.25 |
| 2021-10-01 | 6.25 |
| 2021-10-01 | 6.25 |
| 2021-10-01 | 6.25 |
| 2021-10-01 | 6.25 |
| 2021-10-01 | 6.25 |
| 2021-10-01 | 6.25 |
| 2021-10-01 | 6.25 |
| 2021-10-01 | 6.25 |
| 2021-10-01 | 6.25 |
| 2021-10-01 | 6.25 |
| 2021-10-01 | 6.25 |
| 2021-10-01 | 6.25 |
| 2021-10-01 | 6.25 |
| 2021-10-01 | 6.25 |
| 2021-10-01 | 6.25 |
| 2021-10-01 | 6.25 |
| 2021-10-01 | 6.25 |
| 2021-10-01 | 6.25 |
| 2021-10-01 | 6.25 |
| 2021-10-01 | 7.75 |
| 2021-10-01 | 7.75 |
| 2021-10-01 | 7.75 |
| 2021-10-01 | 7.75 |
| 2021-11-01 | 7.75 |
| 2021-11-01 | 7.75 |
| 2021-11-01 | 7.75 |
| 2021-11-01 | 7.75 |
| 2021-11-01 | 7.75 |
| 2021-11-01 | 7.75 |
| 2021-11-01 | 7.75 |
| 2021-11-01 | 7.75 |
| 2021-11-01 | 7.75 |
| 2021-11-01 | 7.75 |
| 2021-11-01 | 7.75 |
| 2021-11-01 | 7.75 |
| 2021-11-01 | 7.75 |
| 2021-11-01 | 7.75 |
| 2021-11-01 | 7.75 |
| 2021-11-01 | 7.75 |
| 2021-11-01 | 7.75 |
| 2021-11-01 | 7.75 |
| 2021-11-01 | 7.75 |
| 2021-11-01 | 7.75 |
| 2021-11-01 | 7.75 |
| 2021-11-01 | 7.75 |
| 2021-11-01 | 7.75 |
| 2021-11-01 | 7.75 |
| 2021-11-01 | 7.75 |
| 2021-11-01 | 7.75 |
| 2021-11-01 | 7.75 |
| 2021-11-01 | 7.75 |
| 2021-11-01 | 7.75 |
| 2021-11-01 | 7.75 |
| 2021-12-01 | 7.75 |
| 2021-12-01 | 7.75 |
| 2021-12-01 | 7.75 |
| 2021-12-01 | 7.75 |
| 2021-12-01 | 7.75 |
| 2021-12-01 | 7.75 |
| 2021-12-01 | 7.75 |
| 2021-12-01 | 7.75 |
| 2021-12-01 | 9.25 |
| 2021-12-01 | 9.25 |
| 2021-12-01 | 9.25 |
| 2021-12-01 | 9.25 |
| 2021-12-01 | 9.25 |
| 2021-12-01 | 9.25 |
| 2021-12-01 | 9.25 |
| 2021-12-01 | 9.25 |
| 2021-12-01 | 9.25 |
| 2021-12-01 | 9.25 |
| 2021-12-01 | 9.25 |
| 2021-12-01 | 9.25 |
| 2021-12-01 | 9.25 |
| 2021-12-01 | 9.25 |
| 2021-12-01 | 9.25 |
| 2021-12-01 | 9.25 |
| 2021-12-01 | 9.25 |
| 2021-12-01 | 9.25 |
| 2021-12-01 | 9.25 |
| 2021-12-01 | 9.25 |
| 2021-12-01 | 9.25 |
| 2021-12-01 | 9.25 |
| 2021-12-01 | 9.25 |
| 2022-01-01 | 9.25 |
| 2022-01-01 | 9.25 |
| 2022-01-01 | 9.25 |
| 2022-01-01 | 9.25 |
| 2022-01-01 | 9.25 |
| 2022-01-01 | 9.25 |
| 2022-01-01 | 9.25 |
| 2022-01-01 | 9.25 |
| 2022-01-01 | 9.25 |
| 2022-01-01 | 9.25 |
| 2022-01-01 | 9.25 |
| 2022-01-01 | 9.25 |
| 2022-01-01 | 9.25 |
| 2022-01-01 | 9.25 |
| 2022-01-01 | 9.25 |
| 2022-01-01 | 9.25 |
| 2022-01-01 | 9.25 |
| 2022-01-01 | 9.25 |
| 2022-01-01 | 9.25 |
| 2022-01-01 | 9.25 |
| 2022-01-01 | 9.25 |
| 2022-01-01 | 9.25 |
| 2022-01-01 | 9.25 |
| 2022-01-01 | 9.25 |
| 2022-01-01 | 9.25 |
| 2022-01-01 | 9.25 |
| 2022-01-01 | 9.25 |
| 2022-01-01 | 9.25 |
| 2022-01-01 | 9.25 |
| 2022-01-01 | 9.25 |
| 2022-01-01 | 9.25 |
| 2022-02-01 | 9.25 |
| 2022-02-01 | 9.25 |
| 2022-02-01 | 10.75 |
| 2022-02-01 | 10.75 |
| 2022-02-01 | 10.75 |
| 2022-02-01 | 10.75 |
| 2022-02-01 | 10.75 |
| 2022-02-01 | 10.75 |
| 2022-02-01 | 10.75 |
| 2022-02-01 | 10.75 |
| 2022-02-01 | 10.75 |
| 2022-02-01 | 10.75 |
| 2022-02-01 | 10.75 |
| 2022-02-01 | 10.75 |
| 2022-02-01 | 10.75 |
| 2022-02-01 | 10.75 |
| 2022-02-01 | 10.75 |
| 2022-02-01 | 10.75 |
| 2022-02-01 | 10.75 |
| 2022-02-01 | 10.75 |
| 2022-02-01 | 10.75 |
| 2022-02-01 | 10.75 |
| 2022-02-01 | 10.75 |
| 2022-02-01 | 10.75 |
| 2022-02-01 | 10.75 |
| 2022-02-01 | 10.75 |
| 2022-02-01 | 10.75 |
| 2022-02-01 | 10.75 |
| 2022-03-01 | 10.75 |
| 2022-03-01 | 10.75 |
| 2022-03-01 | 10.75 |
| 2022-03-01 | 10.75 |
| 2022-03-01 | 10.75 |
| 2022-03-01 | 10.75 |
| 2022-03-01 | 10.75 |
| 2022-03-01 | 10.75 |
| 2022-03-01 | 10.75 |
| 2022-03-01 | 10.75 |
| 2022-03-01 | 10.75 |
| 2022-03-01 | 10.75 |
| 2022-03-01 | 10.75 |
| 2022-03-01 | 10.75 |
| 2022-03-01 | 10.75 |
| 2022-03-01 | 10.75 |
| 2022-03-01 | 11.75 |
| 2022-03-01 | 11.75 |
| 2022-03-01 | 11.75 |
| 2022-03-01 | 11.75 |
| 2022-03-01 | 11.75 |
| 2022-03-01 | 11.75 |
| 2022-03-01 | 11.75 |
| 2022-03-01 | 11.75 |
| 2022-03-01 | 11.75 |
| 2022-03-01 | 11.75 |
| 2022-03-01 | 11.75 |
| 2022-03-01 | 11.75 |
| 2022-03-01 | 11.75 |
| 2022-03-01 | 11.75 |
| 2022-03-01 | 11.75 |
| 2022-04-01 | 11.75 |
| 2022-04-01 | 11.75 |
| 2022-04-01 | 11.75 |
| 2022-04-01 | 11.75 |
| 2022-04-01 | 11.75 |
| 2022-04-01 | 11.75 |
| 2022-04-01 | 11.75 |
| 2022-04-01 | 11.75 |
| 2022-04-01 | 11.75 |
| 2022-04-01 | 11.75 |
| 2022-04-01 | 11.75 |
| 2022-04-01 | 11.75 |
| 2022-04-01 | 11.75 |
| 2022-04-01 | 11.75 |
| 2022-04-01 | 11.75 |
| 2022-04-01 | 11.75 |
| 2022-04-01 | 11.75 |
| 2022-04-01 | 11.75 |
| 2022-04-01 | 11.75 |
| 2022-04-01 | 11.75 |
| 2022-04-01 | 11.75 |
| 2022-04-01 | 11.75 |
| 2022-04-01 | 11.75 |
| 2022-04-01 | 11.75 |
| 2022-04-01 | 11.75 |
| 2022-04-01 | 11.75 |
| 2022-04-01 | 11.75 |
| 2022-04-01 | 11.75 |
| 2022-04-01 | 11.75 |
| 2022-04-01 | 11.75 |
| 2022-05-01 | 11.75 |
| 2022-05-01 | 11.75 |
| 2022-05-01 | 11.75 |
| 2022-05-01 | 11.75 |
| 2022-05-01 | 12.75 |
| 2022-05-01 | 12.75 |
| 2022-05-01 | 12.75 |
| 2022-05-01 | 12.75 |
| 2022-05-01 | 12.75 |
| 2022-05-01 | 12.75 |
| 2022-05-01 | 12.75 |
| 2022-05-01 | 12.75 |
| 2022-05-01 | 12.75 |
| 2022-05-01 | 12.75 |
| 2022-05-01 | 12.75 |
| 2022-05-01 | 12.75 |
| 2022-05-01 | 12.75 |
| 2022-05-01 | 12.75 |
| 2022-05-01 | 12.75 |
| 2022-05-01 | 12.75 |
| 2022-05-01 | 12.75 |
| 2022-05-01 | 12.75 |
| 2022-05-01 | 12.75 |
| 2022-05-01 | 12.75 |
| 2022-05-01 | 12.75 |
| 2022-05-01 | 12.75 |
| 2022-05-01 | 12.75 |
| 2022-05-01 | 12.75 |
| 2022-05-01 | 12.75 |
| 2022-05-01 | 12.75 |
| 2022-05-01 | 12.75 |
| 2022-06-01 | 12.75 |
| 2022-06-01 | 12.75 |
| 2022-06-01 | 12.75 |
| 2022-06-01 | 12.75 |
| 2022-06-01 | 12.75 |
| 2022-06-01 | 12.75 |
| 2022-06-01 | 12.75 |
| 2022-06-01 | 12.75 |
| 2022-06-01 | 12.75 |
| 2022-06-01 | 12.75 |
| 2022-06-01 | 12.75 |
| 2022-06-01 | 12.75 |
| 2022-06-01 | 12.75 |
| 2022-06-01 | 12.75 |
| 2022-06-01 | 12.75 |
| 2022-06-01 | 13.25 |
| 2022-06-01 | 13.25 |
| 2022-06-01 | 13.25 |
| 2022-06-01 | 13.25 |
| 2022-06-01 | 13.25 |
| 2022-06-01 | 13.25 |
| 2022-06-01 | 13.25 |
| 2022-06-01 | 13.25 |
| 2022-06-01 | 13.25 |
| 2022-06-01 | 13.25 |
| 2022-06-01 | 13.25 |
| 2022-06-01 | 13.25 |
| 2022-06-01 | 13.25 |
| 2022-06-01 | 13.25 |
| 2022-06-01 | 13.25 |
| 2022-07-01 | 13.25 |
| 2022-07-01 | 13.25 |
| 2022-07-01 | 13.25 |
| 2022-07-01 | 13.25 |
| 2022-07-01 | 13.25 |
| 2022-07-01 | 13.25 |
| 2022-07-01 | 13.25 |
| 2022-07-01 | 13.25 |
| 2022-07-01 | 13.25 |
| 2022-07-01 | 13.25 |
| 2022-07-01 | 13.25 |
| 2022-07-01 | 13.25 |
| 2022-07-01 | 13.25 |
| 2022-07-01 | 13.25 |
| 2022-07-01 | 13.25 |
| 2022-07-01 | 13.25 |
| 2022-07-01 | 13.25 |
| 2022-07-01 | 13.25 |
| 2022-07-01 | 13.25 |
| 2022-07-01 | 13.25 |
| 2022-07-01 | 13.25 |
| 2022-07-01 | 13.25 |
| 2022-07-01 | 13.25 |
| 2022-07-01 | 13.25 |
| 2022-07-01 | 13.25 |
| 2022-07-01 | 13.25 |
| 2022-07-01 | 13.25 |
| 2022-07-01 | 13.25 |
| 2022-07-01 | 13.25 |
| 2022-07-01 | 13.25 |
| 2022-07-01 | 13.25 |
| 2022-08-01 | 13.25 |
| 2022-08-01 | 13.25 |
| 2022-08-01 | 13.25 |
| 2022-08-01 | 13.75 |
| 2022-08-01 | 13.75 |
| 2022-08-01 | 13.75 |
| 2022-08-01 | 13.75 |
| 2022-08-01 | 13.75 |
| 2022-08-01 | 13.75 |
| 2022-08-01 | 13.75 |
| 2022-08-01 | 13.75 |
| 2022-08-01 | 13.75 |
| 2022-08-01 | 13.75 |
| 2022-08-01 | 13.75 |
| 2022-08-01 | 13.75 |
| 2022-08-01 | 13.75 |
| 2022-08-01 | 13.75 |
| 2022-08-01 | 13.75 |
| 2022-08-01 | 13.75 |
| 2022-08-01 | 13.75 |
| 2022-08-01 | 13.75 |
| 2022-08-01 | 13.75 |
| 2022-08-01 | 13.75 |
| 2022-08-01 | 13.75 |
| 2022-08-01 | 13.75 |
| 2022-08-01 | 13.75 |
| 2022-08-01 | 13.75 |
| 2022-08-01 | 13.75 |
| 2022-08-01 | 13.75 |
| 2022-08-01 | 13.75 |
| 2022-08-01 | 13.75 |
| 2022-09-01 | 13.75 |
| 2022-09-01 | 13.75 |
| 2022-09-01 | 13.75 |
| 2022-09-01 | 13.75 |
| 2022-09-01 | 13.75 |
| 2022-09-01 | 13.75 |
| 2022-09-01 | 13.75 |
| 2022-09-01 | 13.75 |
| 2022-09-01 | 13.75 |
| 2022-09-01 | 13.75 |
| 2022-09-01 | 13.75 |
| 2022-09-01 | 13.75 |
| 2022-09-01 | 13.75 |
| 2022-09-01 | 13.75 |
| 2022-09-01 | 13.75 |
| 2022-09-01 | 13.75 |
| 2022-09-01 | 13.75 |
| 2022-09-01 | 13.75 |
| 2022-09-01 | 13.75 |
| 2022-09-01 | 13.75 |
| 2022-09-01 | 13.75 |
| 2022-09-01 | 13.75 |
| 2022-09-01 | 13.75 |
| 2022-09-01 | 13.75 |
| 2022-09-01 | 13.75 |
| 2022-09-01 | 13.75 |
| 2022-09-01 | 13.75 |
| 2022-09-01 | 13.75 |
| 2022-09-01 | 13.75 |
| 2022-09-01 | 13.75 |
| 2022-10-01 | 13.75 |
| 2022-10-01 | 13.75 |
| 2022-10-01 | 13.75 |
| 2022-10-01 | 13.75 |
| 2022-10-01 | 13.75 |
| 2022-10-01 | 13.75 |
| 2022-10-01 | 13.75 |
| 2022-10-01 | 13.75 |
| 2022-10-01 | 13.75 |
| 2022-10-01 | 13.75 |
| 2022-10-01 | 13.75 |
| 2022-10-01 | 13.75 |
| 2022-10-01 | 13.75 |
| 2022-10-01 | 13.75 |
| 2022-10-01 | 13.75 |
| 2022-10-01 | 13.75 |
| 2022-10-01 | 13.75 |
| 2022-10-01 | 13.75 |
| 2022-10-01 | 13.75 |
| 2022-10-01 | 13.75 |
| 2022-10-01 | 13.75 |
| 2022-10-01 | 13.75 |
| 2022-10-01 | 13.75 |
| 2022-10-01 | 13.75 |
| 2022-10-01 | 13.75 |
| 2022-10-01 | 13.75 |
| 2022-10-01 | 13.75 |
| 2022-10-01 | 13.75 |
| 2022-10-01 | 13.75 |
| 2022-10-01 | 13.75 |
| 2022-10-01 | 13.75 |
| 2022-11-01 | 13.75 |
| 2022-11-01 | 13.75 |
| 2022-11-01 | 13.75 |
| 2022-11-01 | 13.75 |
| 2022-11-01 | 13.75 |
| 2022-11-01 | 13.75 |
| 2022-11-01 | 13.75 |
| 2022-11-01 | 13.75 |
| 2022-11-01 | 13.75 |
| 2022-11-01 | 13.75 |
| 2022-11-01 | 13.75 |
| 2022-11-01 | 13.75 |
| 2022-11-01 | 13.75 |
| 2022-11-01 | 13.75 |
| 2022-11-01 | 13.75 |
| 2022-11-01 | 13.75 |
| 2022-11-01 | 13.75 |
| 2022-11-01 | 13.75 |
| 2022-11-01 | 13.75 |
| 2022-11-01 | 13.75 |
| 2022-11-01 | 13.75 |
| 2022-11-01 | 13.75 |
| 2022-11-01 | 13.75 |
| 2022-11-01 | 13.75 |
| 2022-11-01 | 13.75 |
| 2022-11-01 | 13.75 |
| 2022-11-01 | 13.75 |
| 2022-11-01 | 13.75 |
| 2022-11-01 | 13.75 |
| 2022-11-01 | 13.75 |
| 2022-12-01 | 13.75 |
| 2022-12-01 | 13.75 |
| 2022-12-01 | 13.75 |
| 2022-12-01 | 13.75 |
| 2022-12-01 | 13.75 |
| 2022-12-01 | 13.75 |
| 2022-12-01 | 13.75 |
| 2022-12-01 | 13.75 |
| 2022-12-01 | 13.75 |
| 2022-12-01 | 13.75 |
| 2022-12-01 | 13.75 |
| 2022-12-01 | 13.75 |
| 2022-12-01 | 13.75 |
| 2022-12-01 | 13.75 |
| 2022-12-01 | 13.75 |
| 2022-12-01 | 13.75 |
| 2022-12-01 | 13.75 |
| 2022-12-01 | 13.75 |
| 2022-12-01 | 13.75 |
| 2022-12-01 | 13.75 |
| 2022-12-01 | 13.75 |
| 2022-12-01 | 13.75 |
| 2022-12-01 | 13.75 |
| 2022-12-01 | 13.75 |
| 2022-12-01 | 13.75 |
| 2022-12-01 | 13.75 |
| 2022-12-01 | 13.75 |
| 2022-12-01 | 13.75 |
| 2022-12-01 | 13.75 |
| 2022-12-01 | 13.75 |
| 2022-12-01 | 13.75 |
| 2023-01-01 | 13.75 |
| 2023-01-01 | 13.75 |
| 2023-01-01 | 13.75 |
| 2023-01-01 | 13.75 |
| 2023-01-01 | 13.75 |
| 2023-01-01 | 13.75 |
| 2023-01-01 | 13.75 |
| 2023-01-01 | 13.75 |
| 2023-01-01 | 13.75 |
| 2023-01-01 | 13.75 |
| 2023-01-01 | 13.75 |
| 2023-01-01 | 13.75 |
| 2023-01-01 | 13.75 |
| 2023-01-01 | 13.75 |
| 2023-01-01 | 13.75 |
| 2023-01-01 | 13.75 |
| 2023-01-01 | 13.75 |
| 2023-01-01 | 13.75 |
| 2023-01-01 | 13.75 |
| 2023-01-01 | 13.75 |
| 2023-01-01 | 13.75 |
| 2023-01-01 | 13.75 |
| 2023-01-01 | 13.75 |
| 2023-01-01 | 13.75 |
| 2023-01-01 | 13.75 |
| 2023-01-01 | 13.75 |
| 2023-01-01 | 13.75 |
| 2023-01-01 | 13.75 |
| 2023-01-01 | 13.75 |
| 2023-01-01 | 13.75 |
| 2023-01-01 | 13.75 |
| 2023-02-01 | 13.75 |
| 2023-02-01 | 13.75 |